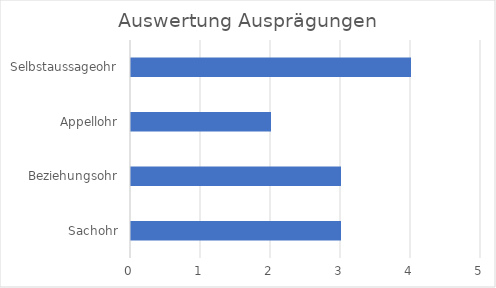
| Category | Series 0 |
|---|---|
| Sachohr | 3 |
| Beziehungsohr | 3 |
| Appellohr | 2 |
| Selbstaussageohr | 4 |